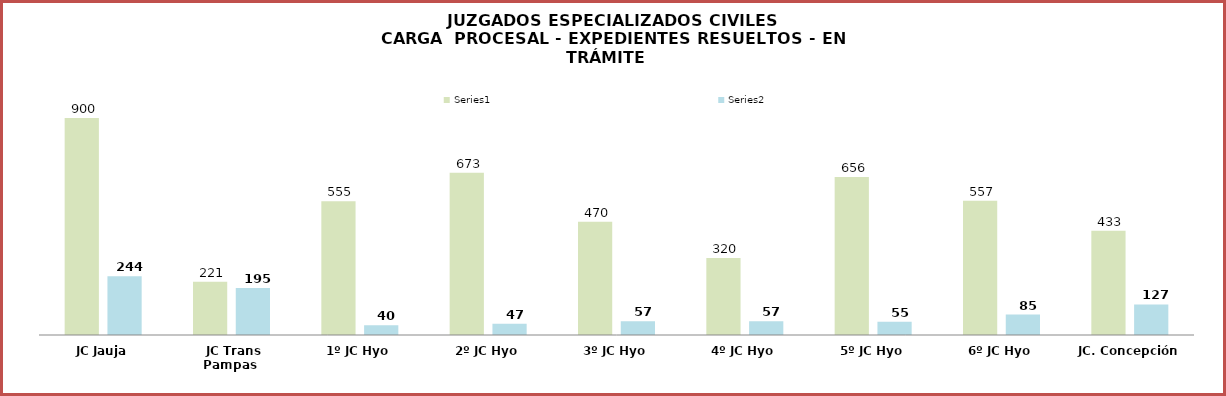
| Category | Series 0 | Series 1 |
|---|---|---|
| JC Jauja | 900 | 244 |
| JC Trans Pampas | 221 | 195 |
| 1º JC Hyo | 555 | 40 |
| 2º JC Hyo | 673 | 47 |
| 3º JC Hyo | 470 | 57 |
| 4º JC Hyo | 320 | 57 |
| 5º JC Hyo | 656 | 55 |
| 6º JC Hyo | 557 | 85 |
| JC. Concepción | 433 | 127 |